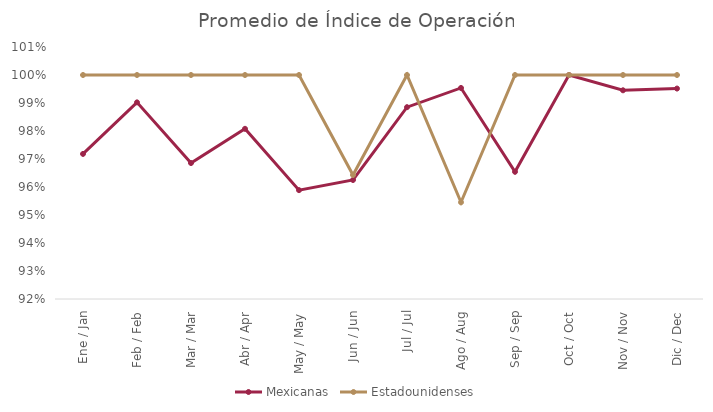
| Category | Mexicanas | Estadounidenses |
|---|---|---|
| Ene / Jan | 0.972 | 1 |
| Feb / Feb | 0.99 | 1 |
| Mar / Mar | 0.969 | 1 |
| Abr / Apr | 0.981 | 1 |
| May / May | 0.959 | 1 |
| Jun / Jun | 0.963 | 0.964 |
| Jul / Jul | 0.989 | 1 |
| Ago / Aug | 0.995 | 0.955 |
| Sep / Sep | 0.965 | 1 |
| Oct / Oct | 1 | 1 |
| Nov / Nov | 0.995 | 1 |
| Dic / Dec | 0.995 | 1 |